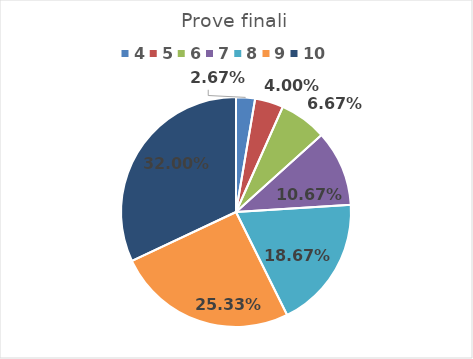
| Category | Series 0 |
|---|---|
| 4.0 | 0.027 |
| 5.0 | 0.04 |
| 6.0 | 0.067 |
| 7.0 | 0.107 |
| 8.0 | 0.187 |
| 9.0 | 0.253 |
| 10.0 | 0.32 |